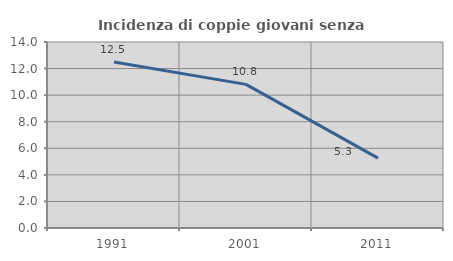
| Category | Incidenza di coppie giovani senza figli |
|---|---|
| 1991.0 | 12.5 |
| 2001.0 | 10.811 |
| 2011.0 | 5.263 |